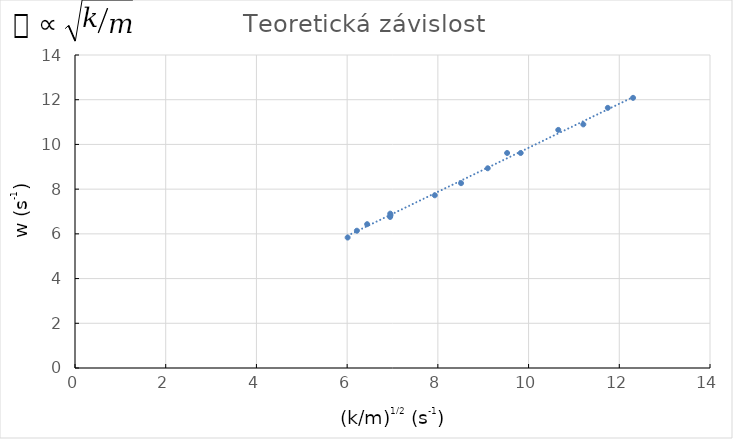
| Category | Teoretická závislost |
|---|---|
| 9.09945053286186 | 8.933 |
| 6.440727127573697 | 6.433 |
| 11.74734012447073 | 11.636 |
| 12.303812197778354 | 12.083 |
| 9.526998190521038 | 9.617 |
| 10.654969830812469 | 10.649 |
| 11.20714058089752 | 10.896 |
| 7.9325816543800425 | 7.725 |
| 6.955726155350572 | 6.83 |
| 8.511456384165939 | 8.267 |
| 6.010984447907307 | 5.836 |
| 6.947255031302648 | 6.756 |
| 9.82607368881035 | 9.617 |
| 6.214865258388796 | 6.14 |
| 6.950689031995669 | 6.905 |